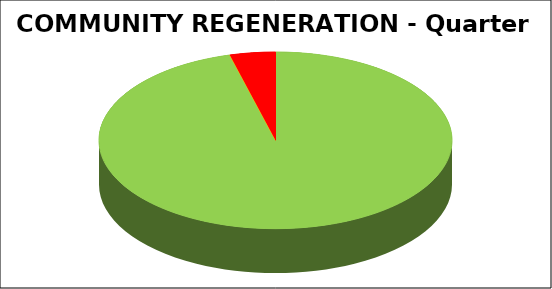
| Category | Series 0 |
|---|---|
| Green | 0.958 |
| Amber | 0 |
| Red | 0.042 |